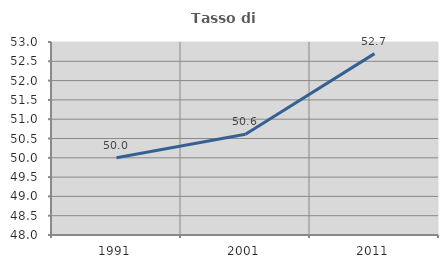
| Category | Tasso di occupazione   |
|---|---|
| 1991.0 | 50 |
| 2001.0 | 50.608 |
| 2011.0 | 52.698 |